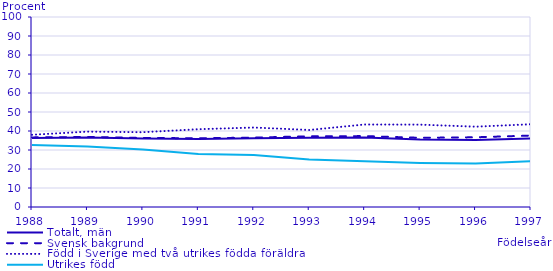
| Category | Totalt, män | Svensk bakgrund | Född i Sverige med två utrikes födda föräldrar | Utrikes född |
|---|---|---|---|---|
| 1988 | 36.375 | 36.636 | 38.01 | 32.692 |
| 1989 | 36.57 | 36.829 | 39.672 | 31.871 |
| 1990 | 36.041 | 36.381 | 39.362 | 30.252 |
| 1991 | 35.758 | 36.153 | 40.938 | 27.909 |
| 1992 | 36.167 | 36.533 | 41.826 | 27.432 |
| 1993 | 36.424 | 37.21 | 40.54 | 24.946 |
| 1994 | 36.537 | 37.317 | 43.421 | 24.13 |
| 1995 | 35.524 | 36.417 | 43.351 | 23.22 |
| 1996 | 35.245 | 36.683 | 42.276 | 22.893 |
| 1997 | 36.025 | 37.609 | 43.559 | 24.075 |